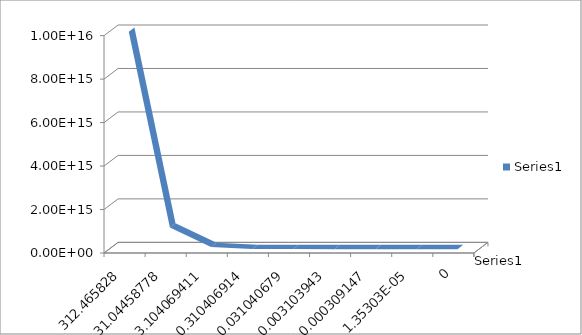
| Category | Series 0 |
|---|---|
| 312.4658280254091 | 10000000000000000 |
| 31.04458778365784 | 1000000000000000 |
| 3.104069410900128 | 100000000000000 |
| 0.310406914317958 | 10000000000000 |
| 0.03104067856907939 | 1000000000000 |
| 0.0031039433966346583 | 100000000000 |
| 0.00030914720731986214 | 10000000000 |
| 1.353032358162128e-05 | 1000000000 |
| 0.0 | 0 |